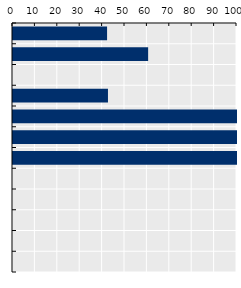
| Category | Series 0 |
|---|---|
| Korea | 41.996 |
| Japan | 60.33 |
| OECD average | 0 |
| Australia | 42.396 |
| Singapore* | 100 |
| Viet Nam* | 100 |
| Indonesia* | 100 |
| New Zealand | 0 |
| Mongolia* | 0 |
| Thailand* | 0 |
| China | 0 |
| Malaysia* | 0 |